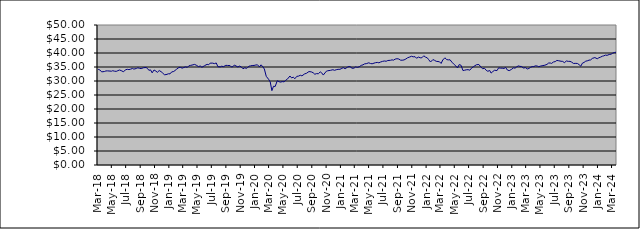
| Category | Series 0 |
|---|---|
| 2014-01-09 | 25.135 |
| 2014-01-17 | 25.208 |
| 2014-01-23 | 25.226 |
| 2014-01-31 | 24.94 |
| 2014-02-10 | 24.988 |
| 2014-02-14 | 25.199 |
| 2014-02-20 | 25.213 |
| 2014-02-28 | 25.404 |
| 2014-03-10 | 25.599 |
| 2014-03-14 | 25.391 |
| 2014-03-20 | 25.494 |
| 2014-03-26 | 25.538 |
| 2014-03-31 | 25.489 |
| 2014-04-09 | 25.47 |
| 2014-04-15 | 25.335 |
| 2014-04-24 | 25.662 |
| 2014-04-30 | 25.688 |
| 2014-05-08 | 25.733 |
| 2014-05-16 | 25.712 |
| 2014-05-22 | 25.855 |
| 2014-05-31 | 26.152 |
| 2014-06-09 | 26.333 |
| 2014-06-16 | 26.256 |
| 2014-06-20 | 26.409 |
| 2014-06-30 | 26.433 |
| 2014-07-09 | 26.464 |
| 2014-07-15 | 26.56 |
| 2014-07-22 | 26.553 |
| 2014-07-31 | 26.563 |
| 2014-08-11 | 26.332 |
| 2014-08-14 | 26.425 |
| 2014-08-21 | 26.716 |
| 2014-08-30 | 26.816 |
| 2014-09-08 | 26.901 |
| 2014-09-16 | 26.761 |
| 2014-09-23 | 26.819 |
| 2014-09-30 | 26.714 |
| 2014-10-09 | 26.671 |
| 2014-10-16 | 25.964 |
| 2014-10-23 | 26.402 |
| 2014-10-31 | 26.881 |
| 2014-11-10 | 27.163 |
| 2014-11-13 | 27.222 |
| 2014-11-20 | 27.283 |
| 2014-11-29 | 27.433 |
| 2014-12-10 | 27.426 |
| 2014-12-18 | 27.04 |
| 2014-12-23 | 27.528 |
| 2014-12-30 | 27.624 |
| 2015-01-08 | 27.202 |
| 2015-01-15 | 27.121 |
| 2015-01-30 | 27.163 |
| 2015-02-10 | 27.348 |
| 2015-02-16 | 27.702 |
| 2015-02-19 | 27.73 |
| 2015-02-28 | 27.78 |
| 2015-03-10 | 27.633 |
| 2015-03-13 | 27.558 |
| 2015-03-19 | 27.792 |
| 2015-03-27 | 27.521 |
| 2015-04-07 | 27.697 |
| 2015-04-16 | 27.922 |
| 2015-04-27 | 27.96 |
| 2015-05-08 | 27.711 |
| 2015-05-14 | 27.833 |
| 2015-05-21 | 28.057 |
| 2015-05-27 | 27.932 |
| 2015-06-03 | 27.999 |
| 2015-06-09 | 27.781 |
| 2015-06-15 | 27.89 |
| 2015-06-22 | 28.003 |
| 2015-06-26 | 27.961 |
| 2015-07-02 | 27.809 |
| 2015-07-09 | 27.621 |
| 2015-07-14 | 27.999 |
| 2015-07-23 | 28.11 |
| 2015-07-29 | 27.971 |
| 2015-08-06 | 28.03 |
| 2015-08-13 | 27.948 |
| 2015-08-20 | 27.897 |
| 2015-08-27 | 26.892 |
| 2015-09-03 | 26.962 |
| 2015-09-09 | 27.104 |
| 2015-09-15 | 27.014 |
| 2015-09-21 | 27.051 |
| 2015-09-28 | 26.866 |
| 2015-10-07 | 27.166 |
| 2015-10-13 | 27.441 |
| 2015-10-22 | 27.497 |
| 2015-10-28 | 27.834 |
| 2015-11-04 | 28.119 |
| 2015-11-13 | 27.618 |
| 2015-11-19 | 27.836 |
| 2015-11-27 | 27.849 |
| 2015-12-03 | 27.85 |
| 2015-12-10 | 27.656 |
| 2015-12-15 | 27.487 |
| 2015-12-23 | 27.631 |
| 2015-12-29 | 27.765 |
| 2016-01-07 | 27.327 |
| 2016-01-14 | 26.601 |
| 2016-01-21 | 26.342 |
| 2016-01-28 | 26.558 |
| 2016-02-04 | 26.763 |
| 2016-02-11 | 26.366 |
| 2016-02-18 | 26.953 |
| 2016-02-25 | 26.989 |
| 2016-03-03 | 27.418 |
| 2016-03-10 | 27.444 |
| 2016-03-16 | 27.655 |
| 2016-03-29 | 27.753 |
| 2016-04-07 | 27.987 |
| 2016-04-14 | 28.133 |
| 2016-04-28 | 28.231 |
| 2016-05-05 | 27.969 |
| 2016-05-12 | 28.098 |
| 2016-05-19 | 28.219 |
| 2016-05-30 | 28.574 |
| 2016-06-03 | 28.621 |
| 2016-06-09 | 28.716 |
| 2016-06-15 | 28.418 |
| 2016-06-23 | 28.432 |
| 2016-06-29 | 28.104 |
| 2016-07-11 | 28.829 |
| 2016-07-14 | 28.997 |
| 2016-07-21 | 29.153 |
| 2016-07-28 | 29.111 |
| 2016-08-04 | 29.108 |
| 2016-08-11 | 29.224 |
| 2016-08-16 | 29.287 |
| 2016-08-24 | 29.318 |
| 2016-08-30 | 29.288 |
| 2016-09-08 | 29.314 |
| 2016-09-15 | 28.841 |
| 2016-09-22 | 29.159 |
| 2016-09-29 | 29.285 |
| 2016-10-06 | 29.207 |
| 2016-10-13 | 29.046 |
| 2016-10-20 | 29.087 |
| 2016-10-28 | 29.011 |
| 2016-11-03 | 28.799 |
| 2016-11-10 | 29.252 |
| 2016-11-15 | 29.156 |
| 2016-11-23 | 29.407 |
| 2016-11-29 | 29.404 |
| 2016-12-07 | 29.509 |
| 2016-12-14 | 30.032 |
| 2016-12-21 | 30.022 |
| 2016-12-28 | 30.045 |
| 2017-01-05 | 30.115 |
| 2017-01-16 | 30.238 |
| 2017-01-23 | 30.226 |
| 2017-01-30 | 30.402 |
| 2017-02-06 | 30.464 |
| 2017-02-13 | 30.641 |
| 2017-02-20 | 30.896 |
| 2017-02-27 | 31.045 |
| 2017-03-06 | 31.141 |
| 2017-03-13 | 31.071 |
| 2017-03-20 | 31.171 |
| 2017-03-27 | 30.993 |
| 2017-03-30 | 31.153 |
| 2017-04-10 | 31.17 |
| 2017-04-18 | 31.138 |
| 2017-04-24 | 31.133 |
| 2017-04-28 | 31.404 |
| 2017-05-08 | 31.484 |
| 2017-05-15 | 31.442 |
| 2017-05-22 | 31.302 |
| 2017-05-30 | 31.569 |
| 2017-06-06 | 31.743 |
| 2017-06-12 | 31.72 |
| 2017-06-15 | 31.764 |
| 2017-06-20 | 31.886 |
| 2017-06-29 | 31.765 |
| 2017-07-04 | 31.662 |
| 2017-07-10 | 31.576 |
| 2017-07-14 | 31.764 |
| 2017-07-19 | 31.878 |
| 2017-07-24 | 31.966 |
| 2017-07-28 | 32.009 |
| 2017-08-03 | 32.047 |
| 2017-08-09 | 32.038 |
| 2017-08-14 | 31.804 |
| 2017-08-21 | 31.717 |
| 2017-08-24 | 31.847 |
| 2017-08-30 | 31.848 |
| 2017-09-07 | 32.034 |
| 2017-09-14 | 32.282 |
| 2017-09-20 | 32.357 |
| 2017-09-29 | 32.341 |
| 2017-10-05 | 32.566 |
| 2017-10-11 | 32.652 |
| 2017-10-16 | 32.685 |
| 2017-10-23 | 32.815 |
| 2017-10-30 | 32.776 |
| 2017-11-07 | 32.444 |
| 2017-11-15 | 32.365 |
| 2017-11-23 | 32.777 |
| 2017-11-29 | 32.921 |
| 2017-12-07 | 33.004 |
| 2017-12-13 | 33.215 |
| 2017-12-18 | 33.358 |
| 2017-12-28 | 33.469 |
| 2018-01-08 | 34.027 |
| 2018-01-17 | 34.292 |
| 2018-01-24 | 34.689 |
| 2018-01-30 | 34.772 |
| 2018-02-05 | 34.204 |
| 2018-02-13 | 33.483 |
| 2018-02-19 | 33.837 |
| 2018-02-27 | 34.167 |
| 2018-03-07 | 33.873 |
| 2018-03-14 | 34.17 |
| 2018-03-21 | 33.955 |
| 2018-03-29 | 33.264 |
| 2018-04-10 | 33.394 |
| 2018-04-16 | 33.596 |
| 2018-04-23 | 33.611 |
| 2018-04-27 | 33.42 |
| 2018-05-10 | 33.495 |
| 2018-05-15 | 33.68 |
| 2018-05-22 | 33.514 |
| 2018-05-30 | 33.436 |
| 2018-06-06 | 33.7 |
| 2018-06-13 | 33.928 |
| 2018-06-20 | 33.712 |
| 2018-06-29 | 33.319 |
| 2018-07-10 | 34.042 |
| 2018-07-16 | 34.178 |
| 2018-07-23 | 34.077 |
| 2018-07-30 | 34.219 |
| 2018-08-07 | 34.479 |
| 2018-08-13 | 34.248 |
| 2018-08-24 | 34.472 |
| 2018-08-30 | 34.72 |
| 2018-09-06 | 34.528 |
| 2018-09-13 | 34.432 |
| 2018-09-24 | 34.752 |
| 2018-09-28 | 34.645 |
| 2018-10-04 | 34.819 |
| 2018-10-10 | 34.504 |
| 2018-10-16 | 33.81 |
| 2018-10-23 | 33.975 |
| 2018-10-30 | 32.915 |
| 2018-11-07 | 33.935 |
| 2018-11-15 | 33.528 |
| 2018-11-21 | 33.097 |
| 2018-11-29 | 33.728 |
| 2018-12-07 | 33.335 |
| 2018-12-14 | 32.831 |
| 2018-12-21 | 32.251 |
| 2018-12-28 | 32.276 |
| 2019-01-08 | 32.591 |
| 2019-01-14 | 32.542 |
| 2019-01-21 | 33.232 |
| 2019-01-30 | 33.4 |
| 2019-02-11 | 34.196 |
| 2019-02-14 | 34.552 |
| 2019-02-21 | 34.837 |
| 2019-02-27 | 34.877 |
| 2019-03-07 | 34.585 |
| 2019-03-14 | 34.816 |
| 2019-03-21 | 35.039 |
| 2019-03-29 | 34.872 |
| 2019-04-04 | 35.403 |
| 2019-04-12 | 35.582 |
| 2019-04-18 | 35.697 |
| 2019-04-29 | 35.924 |
| 2019-05-08 | 35.546 |
| 2019-05-15 | 35.152 |
| 2019-05-23 | 35.354 |
| 2019-05-30 | 34.897 |
| 2019-06-10 | 35.466 |
| 2019-06-14 | 35.441 |
| 2019-06-21 | 35.952 |
| 2019-06-28 | 35.807 |
| 2019-07-04 | 36.387 |
| 2019-07-15 | 36.374 |
| 2019-07-22 | 36.204 |
| 2019-07-30 | 36.438 |
| 2019-08-06 | 35.128 |
| 2019-08-16 | 35.05 |
| 2019-08-22 | 35.274 |
| 2019-08-30 | 35.131 |
| 2019-09-09 | 35.592 |
| 2019-09-16 | 35.549 |
| 2019-09-20 | 35.832 |
| 2019-09-27 | 35.505 |
| 2019-10-03 | 34.999 |
| 2019-10-09 | 35.14 |
| 2019-10-15 | 35.695 |
| 2019-10-30 | 35.008 |
| 2019-11-07 | 35.334 |
| 2019-11-14 | 34.988 |
| 2019-11-21 | 34.361 |
| 2019-11-29 | 34.751 |
| 2019-12-05 | 34.484 |
| 2019-12-11 | 34.851 |
| 2019-12-17 | 35.3 |
| 2019-12-23 | 35.404 |
| 2019-12-30 | 35.526 |
| 2020-01-07 | 35.553 |
| 2020-01-15 | 35.723 |
| 2020-01-22 | 35.771 |
| 2020-01-30 | 35.022 |
| 2020-02-06 | 35.779 |
| 2020-02-14 | 35.033 |
| 2020-02-20 | 34.267 |
| 2020-02-28 | 31.674 |
| 2020-03-09 | 30.618 |
| 2020-03-16 | 29.654 |
| 2020-03-23 | 26.558 |
| 2020-03-30 | 28.133 |
| 2020-04-06 | 28.034 |
| 2020-04-15 | 30.106 |
| 2020-04-23 | 29.739 |
| 2020-04-29 | 29.599 |
| 2020-05-06 | 29.783 |
| 2020-05-14 | 29.703 |
| 2020-05-20 | 30.194 |
| 2020-05-29 | 30.752 |
| 2020-06-08 | 31.783 |
| 2020-06-15 | 31.1 |
| 2020-06-22 | 31.377 |
| 2020-06-29 | 30.802 |
| 2020-07-07 | 31.649 |
| 2020-07-15 | 31.754 |
| 2020-07-22 | 32.059 |
| 2020-07-29 | 31.845 |
| 2020-08-10 | 32.56 |
| 2020-08-17 | 32.731 |
| 2020-08-21 | 32.784 |
| 2020-08-28 | 33.371 |
| 2020-09-07 | 33.253 |
| 2020-09-15 | 32.935 |
| 2020-09-22 | 32.4 |
| 2020-09-29 | 32.636 |
| 2020-10-07 | 32.594 |
| 2020-10-15 | 33.258 |
| 2020-10-21 | 32.935 |
| 2020-10-28 | 32.121 |
| 2020-11-10 | 33.489 |
| 2020-11-16 | 33.659 |
| 2020-11-20 | 33.623 |
| 2020-11-27 | 33.795 |
| 2020-12-08 | 34.026 |
| 2020-12-15 | 33.812 |
| 2020-12-22 | 34.023 |
| 2020-12-30 | 34.177 |
| 2021-01-07 | 34.172 |
| 2021-01-15 | 34.505 |
| 2021-01-21 | 34.774 |
| 2021-01-29 | 34.387 |
| 2021-02-08 | 34.941 |
| 2021-02-15 | 35.175 |
| 2021-02-22 | 35.046 |
| 2021-02-26 | 34.563 |
| 2021-03-08 | 34.59 |
| 2021-03-15 | 35.048 |
| 2021-03-22 | 34.856 |
| 2021-03-30 | 35.075 |
| 2021-04-08 | 35.581 |
| 2021-04-15 | 35.768 |
| 2021-04-22 | 36.12 |
| 2021-04-29 | 36.185 |
| 2021-05-10 | 36.504 |
| 2021-05-17 | 36.243 |
| 2021-05-24 | 36.151 |
| 2021-05-28 | 36.394 |
| 2021-06-07 | 36.53 |
| 2021-06-15 | 36.64 |
| 2021-06-22 | 36.495 |
| 2021-06-29 | 36.771 |
| 2021-07-07 | 36.995 |
| 2021-07-15 | 37.145 |
| 2021-07-23 | 37.049 |
| 2021-07-30 | 37.326 |
| 2021-08-10 | 37.393 |
| 2021-08-17 | 37.55 |
| 2021-08-23 | 37.434 |
| 2021-08-30 | 37.808 |
| 2021-09-07 | 37.968 |
| 2021-09-15 | 37.848 |
| 2021-09-22 | 37.445 |
| 2021-09-29 | 37.418 |
| 2021-10-07 | 37.531 |
| 2021-10-15 | 37.873 |
| 2021-10-22 | 38.289 |
| 2021-10-29 | 38.501 |
| 2021-11-08 | 38.838 |
| 2021-11-15 | 38.636 |
| 2021-11-23 | 38.688 |
| 2021-11-29 | 38.137 |
| 2021-12-08 | 38.549 |
| 2021-12-15 | 38.292 |
| 2021-12-22 | 38.301 |
| 2021-12-30 | 38.991 |
| 2022-01-07 | 38.51 |
| 2022-01-14 | 38.273 |
| 2022-01-20 | 37.617 |
| 2022-01-28 | 36.785 |
| 2022-02-07 | 37.653 |
| 2022-02-14 | 37.382 |
| 2022-02-21 | 37.039 |
| 2022-02-25 | 36.716 |
| 2022-03-07 | 36.875 |
| 2022-03-14 | 36.263 |
| 2022-03-21 | 37.499 |
| 2022-03-30 | 38.29 |
| 2022-04-07 | 37.63 |
| 2022-04-14 | 37.545 |
| 2022-04-21 | 37.586 |
| 2022-04-29 | 36.72 |
| 2022-05-09 | 35.861 |
| 2022-05-16 | 35.334 |
| 2022-05-23 | 34.668 |
| 2022-05-30 | 35.869 |
| 2022-06-07 | 35.61 |
| 2022-06-15 | 33.731 |
| 2022-06-22 | 33.841 |
| 2022-06-29 | 34 |
| 2022-07-07 | 34.046 |
| 2022-07-14 | 33.851 |
| 2022-07-21 | 34.549 |
| 2022-07-29 | 35.069 |
| 2022-08-05 | 35.464 |
| 2022-08-12 | 35.816 |
| 2022-08-22 | 35.891 |
| 2022-08-30 | 34.997 |
| 2022-09-07 | 34.395 |
| 2022-09-15 | 34.529 |
| 2022-09-22 | 33.818 |
| 2022-09-29 | 33.466 |
| 2022-10-07 | 33.756 |
| 2022-10-13 | 32.827 |
| 2022-10-20 | 33.364 |
| 2022-10-28 | 33.854 |
| 2022-11-07 | 33.703 |
| 2022-11-14 | 34.707 |
| 2022-11-21 | 34.588 |
| 2022-11-29 | 34.584 |
| 2022-12-07 | 34.485 |
| 2022-12-14 | 34.839 |
| 2022-12-21 | 33.934 |
| 2022-12-29 | 33.692 |
| 2023-01-09 | 34.214 |
| 2023-01-16 | 34.7 |
| 2023-01-23 | 34.586 |
| 2023-01-30 | 35.066 |
| 2023-02-06 | 35.402 |
| 2023-02-13 | 35.221 |
| 2023-02-20 | 35.17 |
| 2023-02-27 | 34.665 |
| 2023-03-09 | 34.749 |
| 2023-03-16 | 34.299 |
| 2023-03-23 | 34.497 |
| 2023-03-30 | 34.884 |
| 2023-04-06 | 35.149 |
| 2023-04-13 | 35.157 |
| 2023-04-20 | 35.434 |
| 2023-04-28 | 35.326 |
| 2023-05-04 | 35.109 |
| 2023-05-11 | 35.318 |
| 2023-05-18 | 35.441 |
| 2023-05-30 | 35.645 |
| 2023-06-08 | 35.935 |
| 2023-06-15 | 36.422 |
| 2023-06-22 | 36.423 |
| 2023-06-27 | 36.27 |
| 2023-07-06 | 36.808 |
| 2023-07-13 | 36.921 |
| 2023-07-20 | 37.348 |
| 2023-07-28 | 37.233 |
| 2023-08-07 | 37.05 |
| 2023-08-14 | 36.993 |
| 2023-08-21 | 36.554 |
| 2023-08-30 | 37.149 |
| 2023-09-07 | 37.01 |
| 2023-09-14 | 37.019 |
| 2023-09-21 | 36.744 |
| 2023-09-29 | 36.269 |
| 2023-10-09 | 36.304 |
| 2023-10-16 | 36.252 |
| 2023-10-23 | 35.813 |
| 2023-10-30 | 35.28 |
| 2023-11-06 | 36.379 |
| 2023-11-13 | 36.64 |
| 2023-11-20 | 37.081 |
| 2023-11-29 | 37.259 |
| 2023-12-04 | 37.456 |
| 2023-12-11 | 37.523 |
| 2023-12-18 | 38.062 |
| 2023-12-29 | 38.374 |
| 2024-01-08 | 37.945 |
| 2024-01-15 | 38.298 |
| 2024-01-22 | 38.518 |
| 2024-01-30 | 38.86 |
| 2024-02-05 | 38.977 |
| 2024-02-12 | 39.25 |
| 2024-02-19 | 39.166 |
| 2024-02-28 | 39.468 |
| 2024-03-07 | 39.568 |
| 2024-03-14 | 39.943 |
| 2024-03-21 | 40.17 |
| 2024-03-28 | 40.271 |